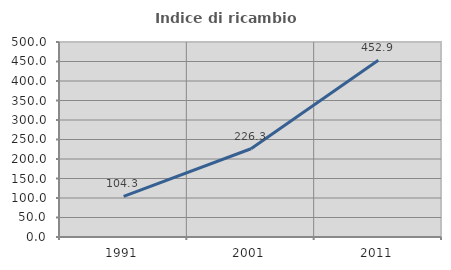
| Category | Indice di ricambio occupazionale  |
|---|---|
| 1991.0 | 104.255 |
| 2001.0 | 226.316 |
| 2011.0 | 452.941 |